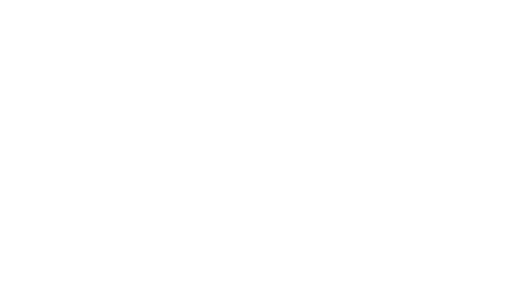
| Category | Series 0 |
|---|---|
| LIVING EXPENSES | 0 |
| INDULGENCE EXPENSES | 0 |
| SAVINGS | 0 |
| TITHINGS | 0 |
| DEBT REPAYMENT | 0 |